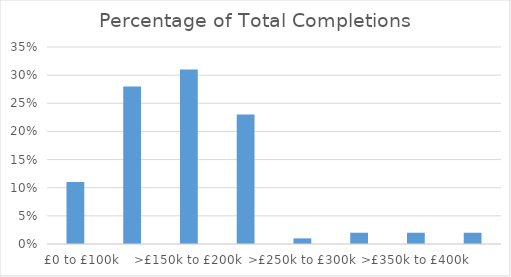
| Category | Series 0 |
|---|---|
|    £0 to £100k | 0.11 |
| >£100k to £150k | 0.28 |
| >£150k to £200k | 0.31 |
| >£200k to £250k | 0.23 |
| >£250k to £300k | 0.01 |
| >£300k to £350k | 0.02 |
| >£350k to £400k | 0.02 |
| >£400k to £450k | 0.02 |